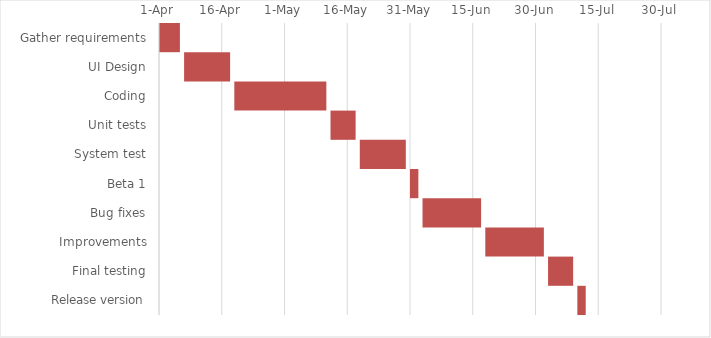
| Category | Start Date | Duration |
|---|---|---|
| Gather requirements | 2014-04-01 | 5 |
| UI Design | 2014-04-07 | 11 |
| Coding | 2014-04-19 | 22 |
| Unit tests | 2014-05-12 | 6 |
| System test | 2014-05-19 | 11 |
| Beta 1 | 2014-05-31 | 2 |
| Bug fixes | 2014-06-03 | 14 |
| Improvements | 2014-06-18 | 14 |
| Final testing | 2014-07-03 | 6 |
| Release version | 2014-07-10 | 2 |